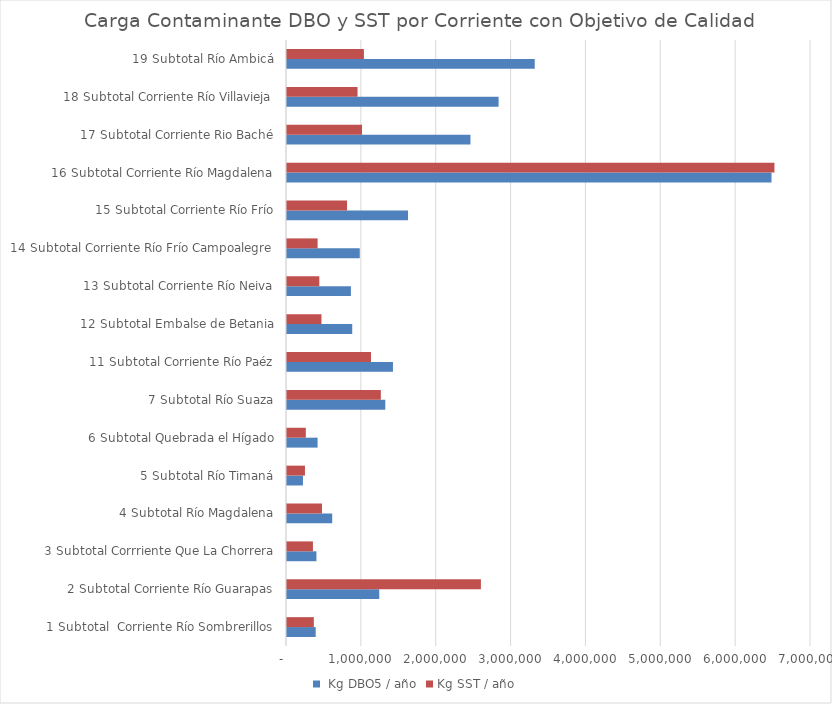
| Category |  Kg DBO5 / año | Kg SST / año |
|---|---|---|
| 1 Subtotal  Corriente Río Sombrerillos | 383459.506 | 358360.332 |
| 2 Subtotal Corriente Río Guarapas | 1232428.842 | 2590238.38 |
| 3 Subtotal Corrriente Que La Chorrera | 393063.019 | 346599.444 |
| 4 Subtotal Río Magdalena | 604002.932 | 467413.27 |
| 5 Subtotal Río Timaná | 212918.174 | 239889.408 |
| 6 Subtotal Quebrada el Hígado | 408533.021 | 251396.027 |
| 7 Subtotal Río Suaza | 1313077.761 | 1253685.85 |
| 11 Subtotal Corriente Río Paéz | 1415540.824 | 1121980.739 |
| 12 Subtotal Embalse de Betania | 871461.899 | 460443.76 |
| 13 Subtotal Corriente Río Neiva | 853727.075 | 431725.254 |
| 14 Subtotal Corriente Río Frío Campoalegre | 971917.228 | 408746.727 |
| 15 Subtotal Corriente Río Frío | 1616778.236 | 801995.646 |
| 16 Subtotal Corriente Río Magdalena | 6472449.809 | 6511583.813 |
| 17 Subtotal Corriente Rio Baché | 2450721.016 | 1002132.932 |
| 18 Subtotal Corriente Río Villavieja | 2826532.105 | 942337.043 |
| 19 Subtotal Río Ambicá | 3309412.044 | 1027339.258 |